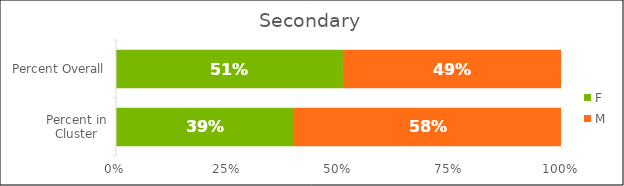
| Category | F | M | Other |
|---|---|---|---|
| Percent in Cluster | 0.387 | 0.581 |  |
| Percent Overall | 0.51 | 0.49 |  |